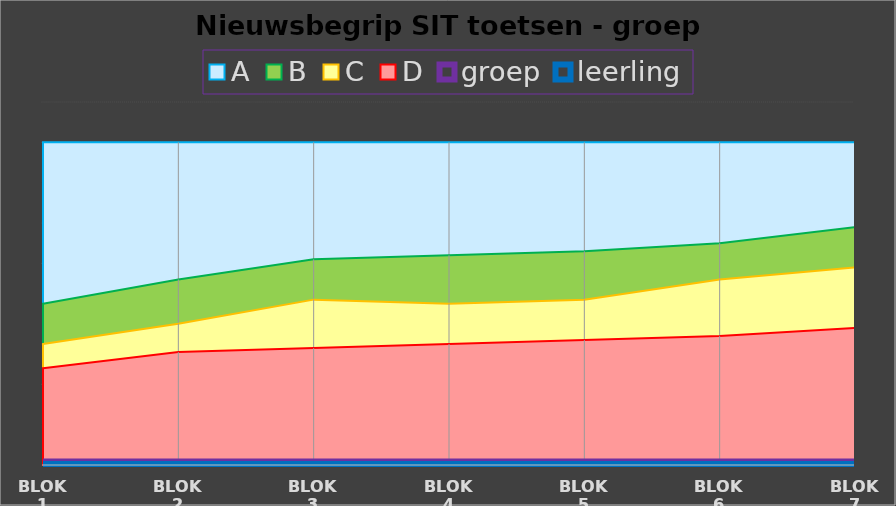
| Category | A | B | C | D | groep | leerling |
|---|---|---|---|---|---|---|
| blok 1 | 40 | 20 | 15 | 12 | 0 | 0 |
| blok 2 | 40 | 23 | 17.5 | 14 | 0 | 0 |
| blok 3 | 40 | 25.5 | 20.5 | 14.5 | 0 | 0 |
| blok 4 | 40 | 26 | 20 | 15 | 0 | 0 |
| blok 5 | 40 | 26.5 | 20.5 | 15.5 | 0 | 0 |
| blok 6 | 40 | 27.5 | 23 | 16 | 0 | 0 |
| blok 7 | 40 | 29.5 | 24.5 | 17 | 0 | 0 |